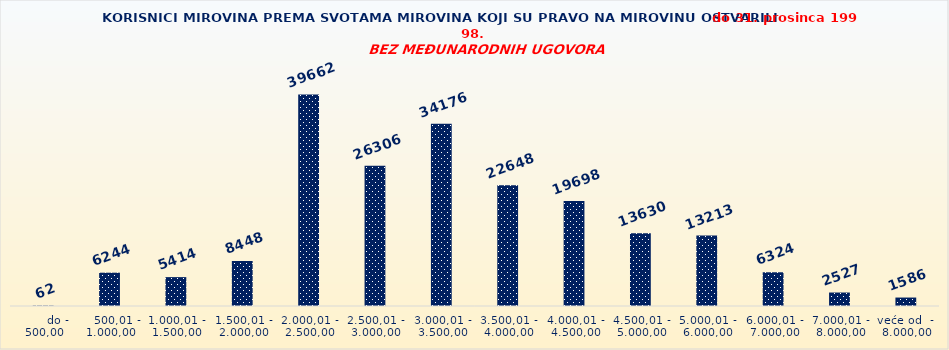
| Category | Series 0 |
|---|---|
|       do - 500,00 | 62 |
|    500,01 - 1.000,00 | 6244 |
| 1.000,01 - 1.500,00 | 5414 |
| 1.500,01 - 2.000,00 | 8448 |
| 2.000,01 - 2.500,00 | 39662 |
| 2.500,01 - 3.000,00 | 26306 |
| 3.000,01 - 3.500,00 | 34176 |
| 3.500,01 - 4.000,00 | 22648 |
| 4.000,01 - 4.500,00 | 19698 |
| 4.500,01 - 5.000,00 | 13630 |
| 5.000,01 - 6.000,00 | 13213 |
| 6.000,01 - 7.000,00 | 6324 |
| 7.000,01 - 8.000,00 | 2527 |
| veće od  -  8.000,00 | 1586 |